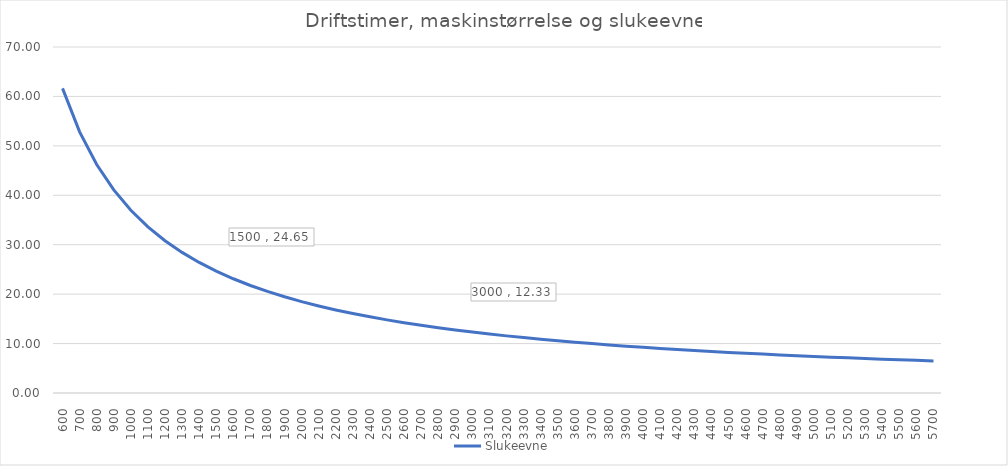
| Category | Slukeevne |
|---|---|
| 600.0 | 61.634 |
| 700.0 | 52.829 |
| 800.0 | 46.226 |
| 900.0 | 41.09 |
| 1000.0 | 36.981 |
| 1100.0 | 33.619 |
| 1200.0 | 30.817 |
| 1300.0 | 28.447 |
| 1400.0 | 26.415 |
| 1500.0 | 24.654 |
| 1600.0 | 23.113 |
| 1700.0 | 21.753 |
| 1800.0 | 20.545 |
| 1900.0 | 19.463 |
| 2000.0 | 18.49 |
| 2100.0 | 17.61 |
| 2200.0 | 16.809 |
| 2300.0 | 16.079 |
| 2400.0 | 15.409 |
| 2500.0 | 14.792 |
| 2600.0 | 14.223 |
| 2700.0 | 13.697 |
| 2800.0 | 13.207 |
| 2900.0 | 12.752 |
| 3000.0 | 12.327 |
| 3100.0 | 11.929 |
| 3200.0 | 11.556 |
| 3300.0 | 11.206 |
| 3400.0 | 10.877 |
| 3500.0 | 10.566 |
| 3600.0 | 10.272 |
| 3700.0 | 9.995 |
| 3800.0 | 9.732 |
| 3900.0 | 9.482 |
| 4000.0 | 9.245 |
| 4100.0 | 9.02 |
| 4200.0 | 8.805 |
| 4300.0 | 8.6 |
| 4400.0 | 8.405 |
| 4500.0 | 8.218 |
| 4600.0 | 8.039 |
| 4700.0 | 7.868 |
| 4800.0 | 7.704 |
| 4900.0 | 7.547 |
| 5000.0 | 7.396 |
| 5100.0 | 7.251 |
| 5200.0 | 7.112 |
| 5300.0 | 6.977 |
| 5400.0 | 6.848 |
| 5500.0 | 6.724 |
| 5600.0 | 6.604 |
| 5700.0 | 6.488 |